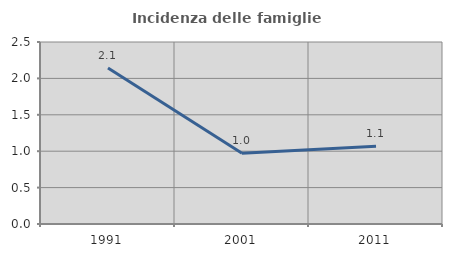
| Category | Incidenza delle famiglie numerose |
|---|---|
| 1991.0 | 2.141 |
| 2001.0 | 0.971 |
| 2011.0 | 1.067 |